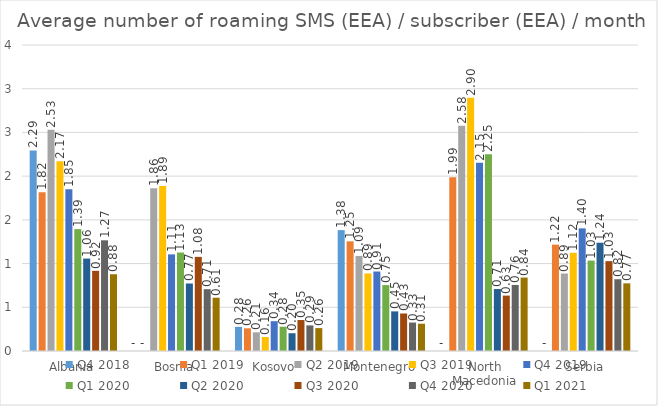
| Category | Q4 2018 | Q1 2019 | Q2 2019 | Q3 2019 | Q4 2019 | Q1 2020 | Q2 2020 | Q3 2020 | Q4 2020 | Q1 2021 |
|---|---|---|---|---|---|---|---|---|---|---|
| Albania | 2.294 | 1.815 | 2.53 | 2.17 | 1.851 | 1.394 | 1.057 | 0.917 | 1.266 | 0.878 |
| Bosnia | 0 | 0 | 1.863 | 1.888 | 1.105 | 1.127 | 0.772 | 1.077 | 0.707 | 0.609 |
| Kosovo* | 0.276 | 0.26 | 0.214 | 0.16 | 0.341 | 0.278 | 0.203 | 0.354 | 0.293 | 0.262 |
| Montenegro | 1.383 | 1.254 | 1.087 | 0.887 | 0.909 | 0.754 | 0.453 | 0.429 | 0.326 | 0.312 |
| North Macedonia | 0 | 1.987 | 2.575 | 2.898 | 2.153 | 2.249 | 0.709 | 0.634 | 0.756 | 0.84 |
| Serbia | 0 | 1.217 | 0.886 | 1.124 | 1.403 | 1.034 | 1.238 | 1.028 | 0.821 | 0.774 |